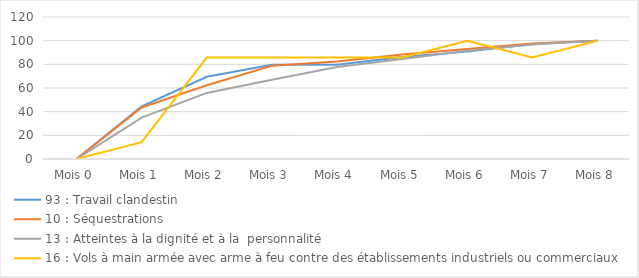
| Category | 93 : Travail clandestin | 10 : Séquestrations | 13 : Atteintes à la dignité et à la  personnalité | 16 : Vols à main armée avec arme à feu contre des établissements industriels ou commerciaux |
|---|---|---|---|---|
| Mois 0 | 0 | 0 | 0 | 0 |
| Mois 1 | 44.444 | 43.529 | 34.921 | 14.286 |
| Mois 2 | 69.444 | 62.353 | 55.844 | 85.714 |
| Mois 3 | 79.63 | 78.824 | 66.955 | 85.714 |
| Mois 4 | 79.63 | 82.353 | 77.706 | 85.714 |
| Mois 5 | 86.111 | 88.235 | 84.56 | 85.714 |
| Mois 6 | 90.741 | 92.941 | 91.414 | 100 |
| Mois 7 | 97.222 | 97.647 | 96.681 | 85.714 |
| Mois 8 | 100 | 100 | 100 | 100 |